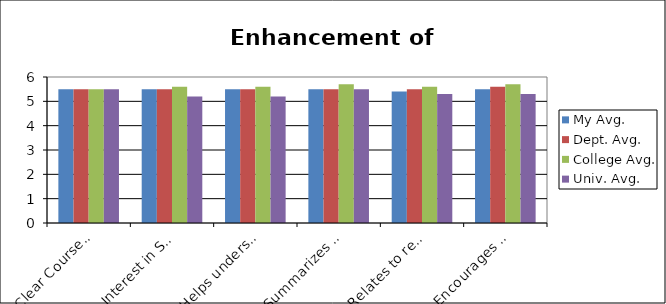
| Category | My Avg. | Dept. Avg. | College Avg. | Univ. Avg. |
|---|---|---|---|---|
| Clear Course Objectives | 5.5 | 5.5 | 5.5 | 5.5 |
| Interest in Subject | 5.5 | 5.5 | 5.6 | 5.2 |
| Helps understands relations | 5.5 | 5.5 | 5.6 | 5.2 |
| Summarizes topics | 5.5 | 5.5 | 5.7 | 5.5 |
| Relates to real life | 5.4 | 5.5 | 5.6 | 5.3 |
| Encourages Critical Thinking | 5.5 | 5.6 | 5.7 | 5.3 |